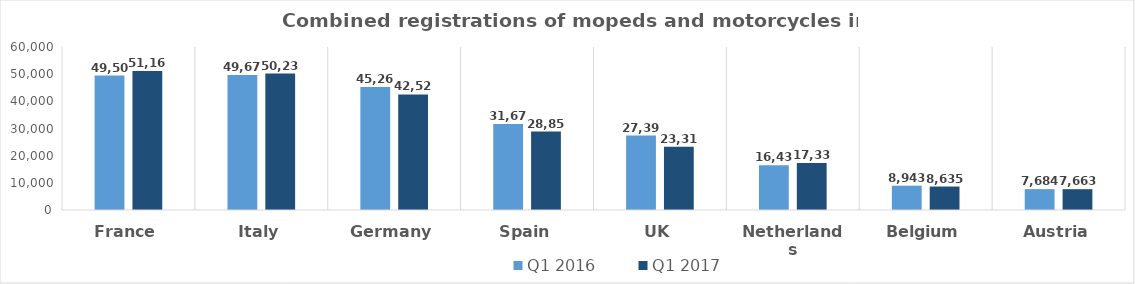
| Category | Q1 2016 | Q1 2017 |
|---|---|---|
| France | 49505 | 51164 |
| Italy | 49677 | 50230 |
| Germany | 45262 | 42525 |
| Spain | 31679 | 28851 |
| UK | 27395 | 23313 |
| Netherlands | 16432 | 17330 |
| Belgium | 8943 | 8635 |
| Austria | 7684 | 7663 |